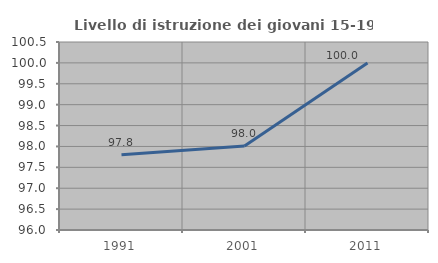
| Category | Livello di istruzione dei giovani 15-19 anni |
|---|---|
| 1991.0 | 97.799 |
| 2001.0 | 98.008 |
| 2011.0 | 100 |